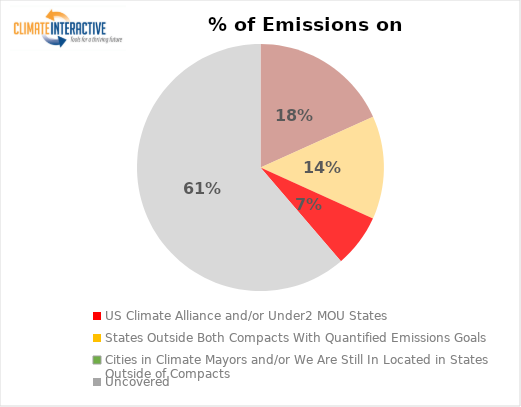
| Category | % of Emissions |
|---|---|
| US Climate Alliance and/or Under2 MOU States | 0.183 |
| States Outside Both Compacts With Quantified Emissions Goals | 0.135 |
| Cities in Climate Mayors and/or We Are Still In Located in States Outside of Compacts | 0.069 |
| Uncovered | 0.613 |